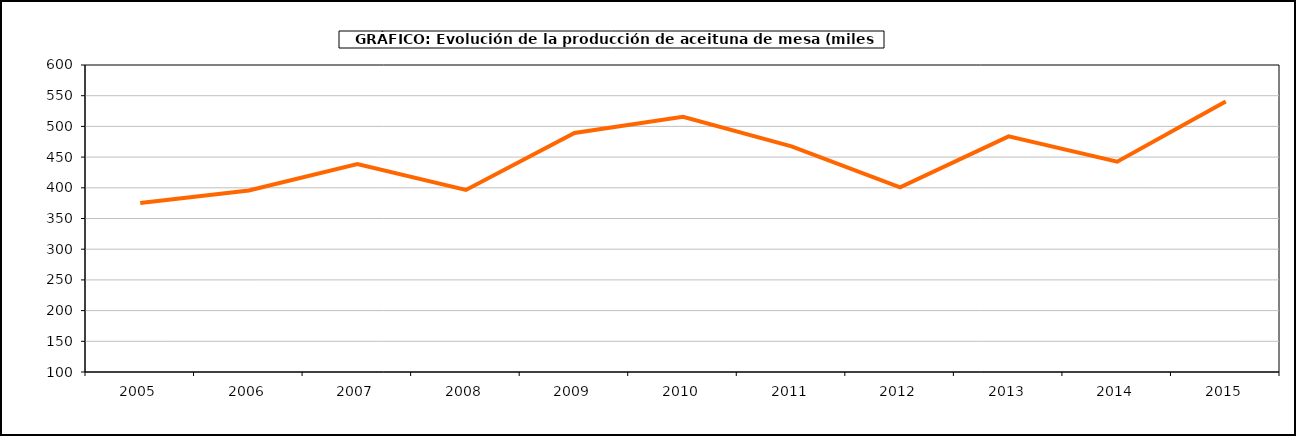
| Category | producción |
|---|---|
| 2005.0 | 375.419 |
| 2006.0 | 395.676 |
| 2007.0 | 438.572 |
| 2008.0 | 396.432 |
| 2009.0 | 489.368 |
| 2010.0 | 515.591 |
| 2011.0 | 467.363 |
| 2012.0 | 400.651 |
| 2013.0 | 483.713 |
| 2014.0 | 442.478 |
| 2015.0 | 540.484 |